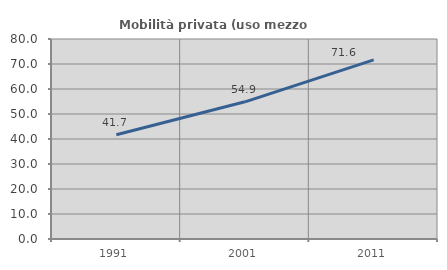
| Category | Mobilità privata (uso mezzo privato) |
|---|---|
| 1991.0 | 41.699 |
| 2001.0 | 54.872 |
| 2011.0 | 71.622 |